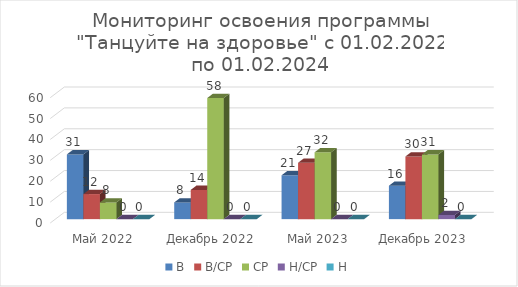
| Category | В | В/СР | СР | Н/СР | Н |
|---|---|---|---|---|---|
| Май 2022 | 31 | 12 | 8 | 0 | 0 |
| Декабрь 2022 | 8 | 14 | 58 | 0 | 0 |
| Май 2023 | 21 | 27 | 32 | 0 | 0 |
| Декабрь 2023  | 16 | 30 | 31 | 2 | 0 |